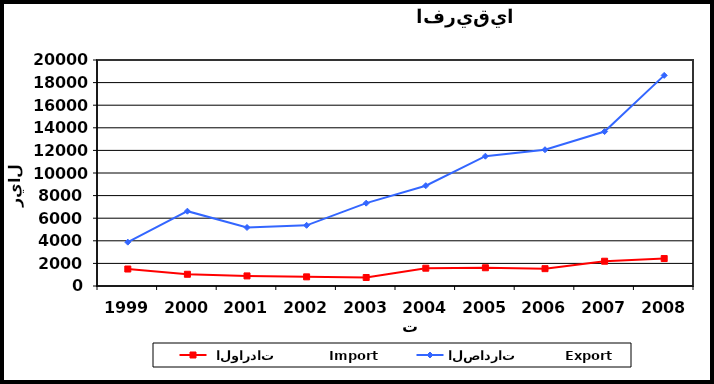
| Category |  الواردات           Import | الصادرات          Export |
|---|---|---|
| 1999.0 | 1502 | 3880 |
| 2000.0 | 1038 | 6621 |
| 2001.0 | 893 | 5178 |
| 2002.0 | 809 | 5370 |
| 2003.0 | 751 | 7331 |
| 2004.0 | 1576 | 8876 |
| 2005.0 | 1614 | 11487 |
| 2006.0 | 1534 | 12060 |
| 2007.0 | 2193 | 13669 |
| 2008.0 | 2430 | 18638 |